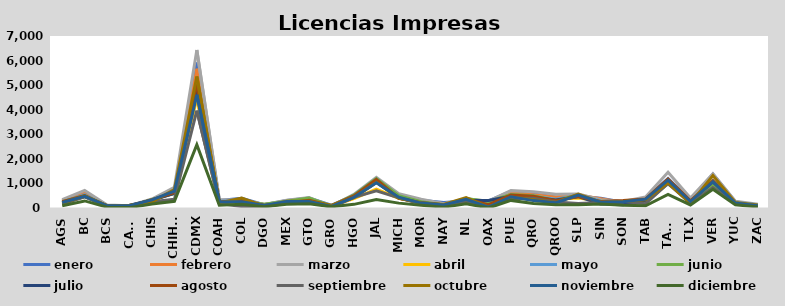
| Category | enero | febrero | marzo | abril | mayo | junio | julio | agosto | septiembre | octubre | noviembre | diciembre |
|---|---|---|---|---|---|---|---|---|---|---|---|---|
| AGS | 311 | 300 | 337 | 199 | 239 | 253 | 201 | 259 | 151 | 204 | 222 | 95 |
| BC | 560 | 648 | 719 | 502 | 547 | 506 | 461 | 509 | 453 | 480 | 472 | 288 |
| BCS | 98 | 86 | 126 | 55 | 69 | 84 | 95 | 80 | 65 | 95 | 87 | 35 |
| CAMP | 94 | 59 | 95 | 70 | 76 | 67 | 113 | 77 | 82 | 111 | 96 | 16 |
| CHIS | 322 | 326 | 366 | 285 | 330 | 352 | 317 | 334 | 256 | 253 | 332 | 162 |
| CHIHU | 711 | 644 | 846 | 670 | 598 | 591 | 598 | 624 | 356 | 753 | 687 | 271 |
| CDMX | 5921 | 5668 | 6428 | 4449 | 4836 | 5025 | 4756 | 5048 | 3961 | 5351 | 4607 | 2575 |
| COAH | 304 | 252 | 349 | 255 | 273 | 231 | 222 | 240 | 188 | 204 | 242 | 115 |
| COL | 398 | 316 | 313 | 244 | 298 | 285 | 319 | 284 | 58 | 408 | 256 | 153 |
| DGO | 134 | 139 | 144 | 76 | 111 | 157 | 106 | 103 | 47 | 71 | 102 | 54 |
| MEX | 301 | 254 | 313 | 205 | 188 | 280 | 215 | 203 | 188 | 273 | 269 | 153 |
| GTO | 409 | 362 | 422 | 289 | 203 | 410 | 255 | 317 | 263 | 270 | 269 | 176 |
| GRO | 114 | 96 | 70 | 73 | 82 | 87 | 76 | 92 | 27 | 105 | 65 | 50 |
| HGO | 504 | 520 | 554 | 386 | 522 | 523 | 431 | 489 | 430 | 434 | 435 | 148 |
| JAL | 1205 | 1094 | 1249 | 764 | 1192 | 1191 | 1061 | 1166 | 701 | 1042 | 1031 | 345 |
| MICH | 476 | 490 | 577 | 396 | 471 | 496 | 403 | 392 | 412 | 401 | 438 | 198 |
| MOR | 311 | 306 | 359 | 221 | 234 | 253 | 209 | 199 | 174 | 213 | 199 | 113 |
| NAY | 228 | 178 | 175 | 106 | 101 | 123 | 132 | 103 | 104 | 142 | 124 | 33 |
| NL | 285 | 317 | 362 | 261 | 389 | 388 | 308 | 366 | 266 | 421 | 356 | 175 |
| OAX | 288 | 248 | 281 | 176 | 237 | 267 | 306 | 137 | 30 | 33 | 38 | 1 |
| PUE | 683 | 614 | 707 | 498 | 492 | 553 | 476 | 524 | 385 | 448 | 458 | 309 |
| QRO | 585 | 543 | 665 | 492 | 488 | 502 | 430 | 480 | 392 | 333 | 301 | 187 |
| QROO | 452 | 445 | 562 | 342 | 361 | 311 | 331 | 298 | 243 | 227 | 212 | 132 |
| SLP | 476 | 533 | 574 | 406 | 516 | 523 | 460 | 464 | 179 | 566 | 522 | 135 |
| SIN | 399 | 379 | 340 | 289 | 289 | 202 | 164 | 266 | 223 | 237 | 236 | 160 |
| SON | 235 | 226 | 266 | 201 | 223 | 248 | 131 | 305 | 266 | 266 | 257 | 107 |
| TAB | 391 | 234 | 451 | 230 | 288 | 342 | 313 | 371 | 177 | 339 | 359 | 88 |
| TAMS | 1201 | 1100 | 1455 | 993 | 982 | 1158 | 1123 | 1177 | 997 | 1022 | 1132 | 553 |
| TLX | 337 | 309 | 404 | 286 | 279 | 273 | 266 | 290 | 194 | 187 | 262 | 126 |
| VER | 1380 | 1080 | 1388 | 901 | 1123 | 975 | 1059 | 1110 | 833 | 1321 | 1071 | 758 |
| YUC | 257 | 199 | 273 | 216 | 222 | 201 | 194 | 187 | 171 | 224 | 199 | 135 |
| ZAC | 115 | 120 | 157 | 81 | 132 | 95 | 82 | 78 | 76 | 124 | 92 | 41 |